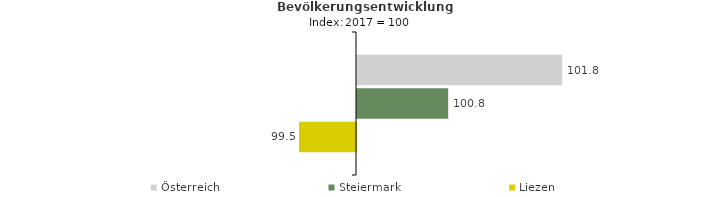
| Category | Österreich | Steiermark | Liezen |
|---|---|---|---|
| 2021.0 | 101.8 | 100.8 | 99.5 |